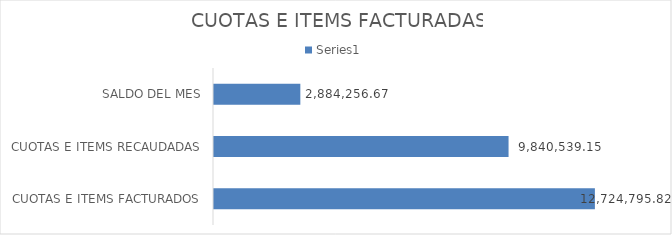
| Category | Series 0 |
|---|---|
| CUOTAS E ITEMS FACTURADOS | 12724795.82 |
| CUOTAS E ITEMS RECAUDADAS | 9840539.15 |
| SALDO DEL MES | 2884256.67 |